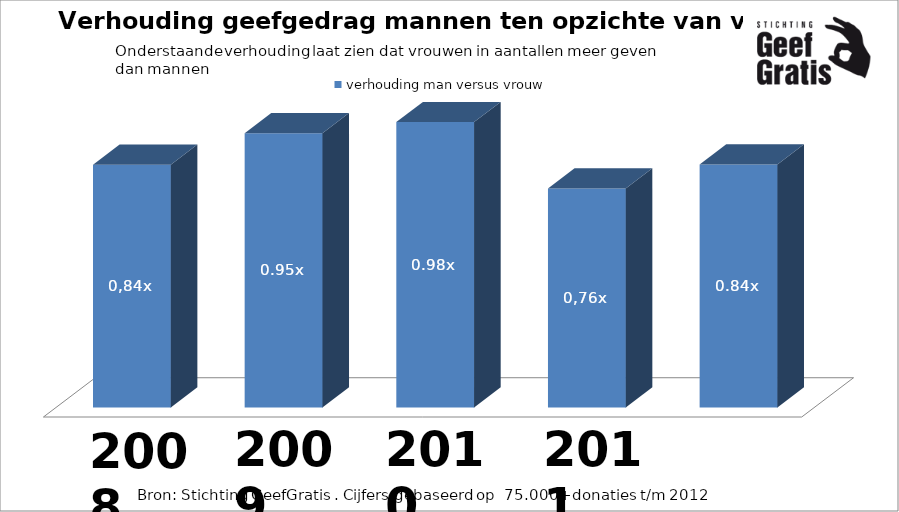
| Category | verhouding man versus vrouw |
|---|---|
| 0 | 0.838 |
| 1 | 0.947 |
| 2 | 0.985 |
| 3 | 0.756 |
| 4 | 0.838 |